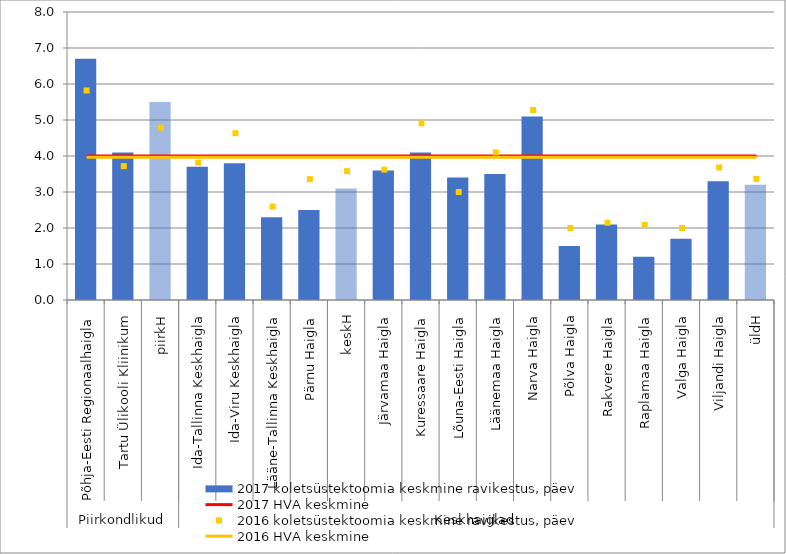
| Category | 2017 koletsüstektoomia keskmine ravikestus, päev |
|---|---|
| 0 | 6.7 |
| 1 | 4.1 |
| 2 | 5.5 |
| 3 | 3.7 |
| 4 | 3.8 |
| 5 | 2.3 |
| 6 | 2.5 |
| 7 | 3.1 |
| 8 | 3.6 |
| 9 | 4.1 |
| 10 | 3.4 |
| 11 | 3.5 |
| 12 | 5.1 |
| 13 | 1.5 |
| 14 | 2.1 |
| 15 | 1.2 |
| 16 | 1.7 |
| 17 | 3.3 |
| 18 | 3.2 |